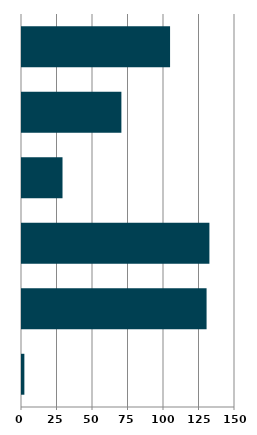
| Category | Series 0 |
|---|---|
| 0 | 1.67 |
| 1 | 129.985 |
| 2 | 131.978 |
| 3 | 28.531 |
| 4 | 69.993 |
| 5 | 104.275 |